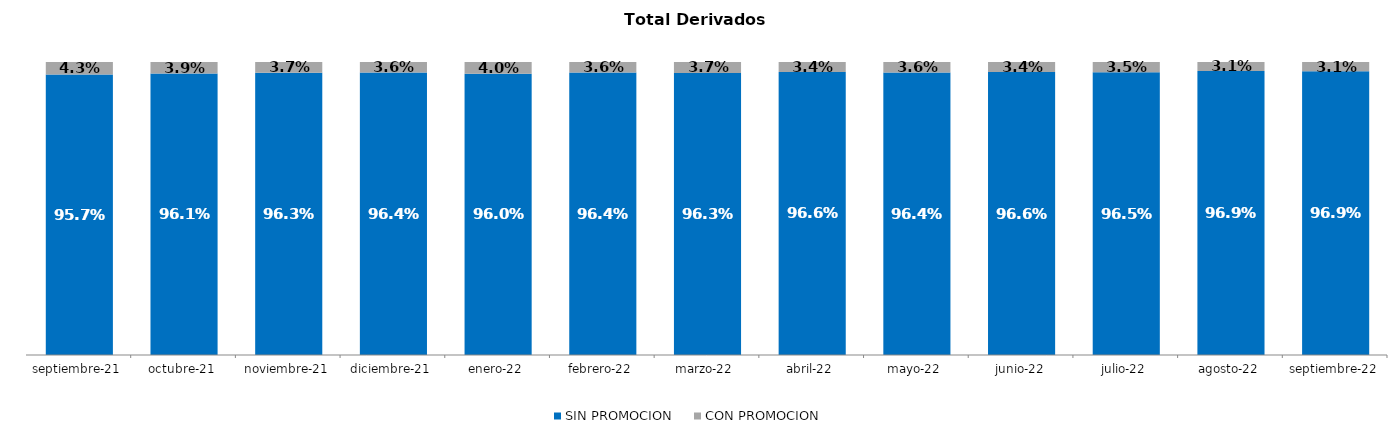
| Category | SIN PROMOCION   | CON PROMOCION   |
|---|---|---|
| 2021-09-01 | 0.957 | 0.043 |
| 2021-10-01 | 0.961 | 0.039 |
| 2021-11-01 | 0.963 | 0.037 |
| 2021-12-01 | 0.964 | 0.036 |
| 2022-01-01 | 0.96 | 0.04 |
| 2022-02-01 | 0.964 | 0.036 |
| 2022-03-01 | 0.963 | 0.037 |
| 2022-04-01 | 0.966 | 0.034 |
| 2022-05-01 | 0.964 | 0.036 |
| 2022-06-01 | 0.966 | 0.034 |
| 2022-07-01 | 0.965 | 0.035 |
| 2022-08-01 | 0.969 | 0.031 |
| 2022-09-01 | 0.969 | 0.031 |